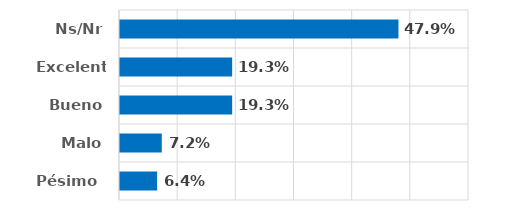
| Category | Series 0 |
|---|---|
| Pésimo  | 0.064 |
| Malo | 0.072 |
| Bueno | 0.193 |
| Excelente | 0.193 |
| Ns/Nr | 0.479 |